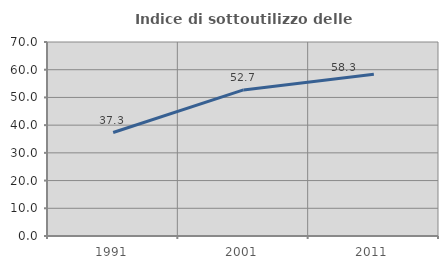
| Category | Indice di sottoutilizzo delle abitazioni  |
|---|---|
| 1991.0 | 37.333 |
| 2001.0 | 52.703 |
| 2011.0 | 58.333 |